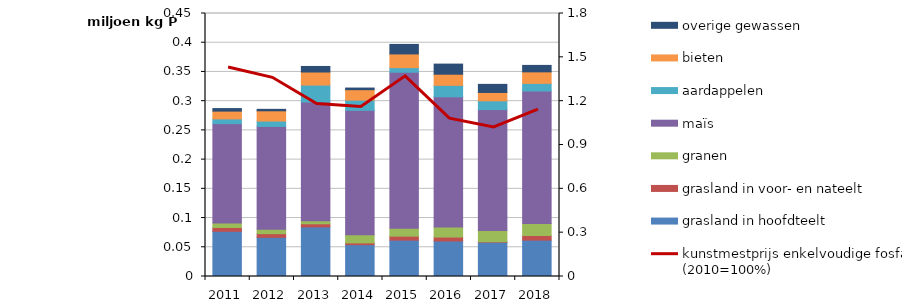
| Category | grasland in hoofdteelt | grasland in voor- en nateelt | granen | maïs | aardappelen | bieten | overige gewassen |
|---|---|---|---|---|---|---|---|
| 2011.0 | 77324.784 | 6504.943 | 7714.047 | 170022.42 | 8117.504 | 13306.937 | 4327.283 |
| 2012.0 | 67034.248 | 6224.552 | 7584.07 | 175916.484 | 9207.663 | 17549.188 | 2487.154 |
| 2013.0 | 84851.128 | 5359.303 | 5090.93 | 203237.975 | 29022.875 | 22306.727 | 9517.584 |
| 2014.0 | 54436.312 | 3016.692 | 14064.134 | 212785.337 | 17470.338 | 17884.482 | 2786.608 |
| 2015.0 | 62232.724 | 6786.222 | 13409.929 | 267086.249 | 7856.624 | 23474.713 | 16265.429 |
| 2016.0 | 60777.401 | 6721.483 | 17108.841 | 222821.157 | 19651.813 | 19020.189 | 17334.081 |
| 2017.0 | 58616.306 | 806.938 | 19368.795 | 206789.691 | 15058.04 | 14247.253 | 13841.441 |
| 2018.0 | 62214.951 | 7923.287 | 20346.538 | 226840.318 | 13129.501 | 19721.845 | 11009.7 |